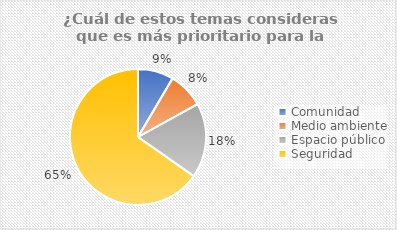
| Category | Cantidad |
|---|---|
| Comunidad | 10 |
| Medio ambiente | 10 |
| Espacio público | 21 |
| Seguridad | 77 |